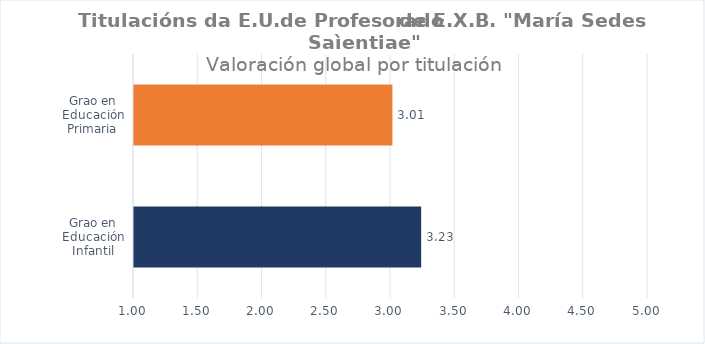
| Category | Series 0 |
|---|---|
| Grao en Educación Infantil | 3.235 |
| Grao en Educación Primaria | 3.011 |